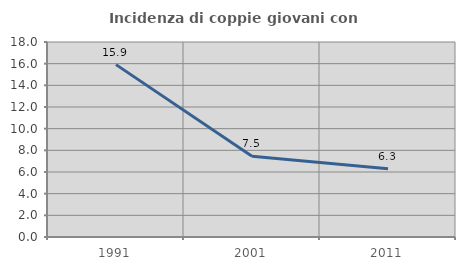
| Category | Incidenza di coppie giovani con figli |
|---|---|
| 1991.0 | 15.912 |
| 2001.0 | 7.464 |
| 2011.0 | 6.308 |